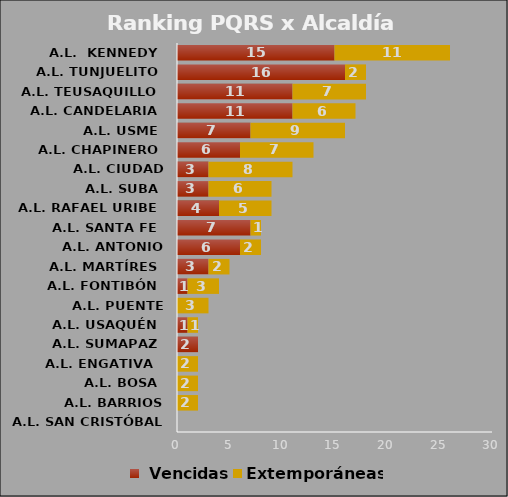
| Category |  Vencidas | Extemporáneas |
|---|---|---|
| A.L. SAN CRISTÓBAL | 0 | 0 |
| A.L. BARRIOS UNIDOS | 0 | 2 |
| A.L. BOSA | 0 | 2 |
| A.L. ENGATIVA  | 0 | 2 |
| A.L. SUMAPAZ | 2 | 0 |
| A.L. USAQUÉN | 1 | 1 |
| A.L. PUENTE ARANDA | 0 | 3 |
| A.L. FONTIBÓN | 1 | 3 |
| A.L. MARTÍRES | 3 | 2 |
| A.L. ANTONIO NARINO | 6 | 2 |
| A.L. SANTA FE | 7 | 1 |
| A.L. RAFAEL URIBE | 4 | 5 |
| A.L. SUBA | 3 | 6 |
| A.L. CIUDAD BOLÍVAR | 3 | 8 |
| A.L. CHAPINERO | 6 | 7 |
| A.L. USME | 7 | 9 |
| A.L. CANDELARIA | 11 | 6 |
| A.L. TEUSAQUILLO | 11 | 7 |
| A.L. TUNJUELITO | 16 | 2 |
| A.L.  KENNEDY | 15 | 11 |